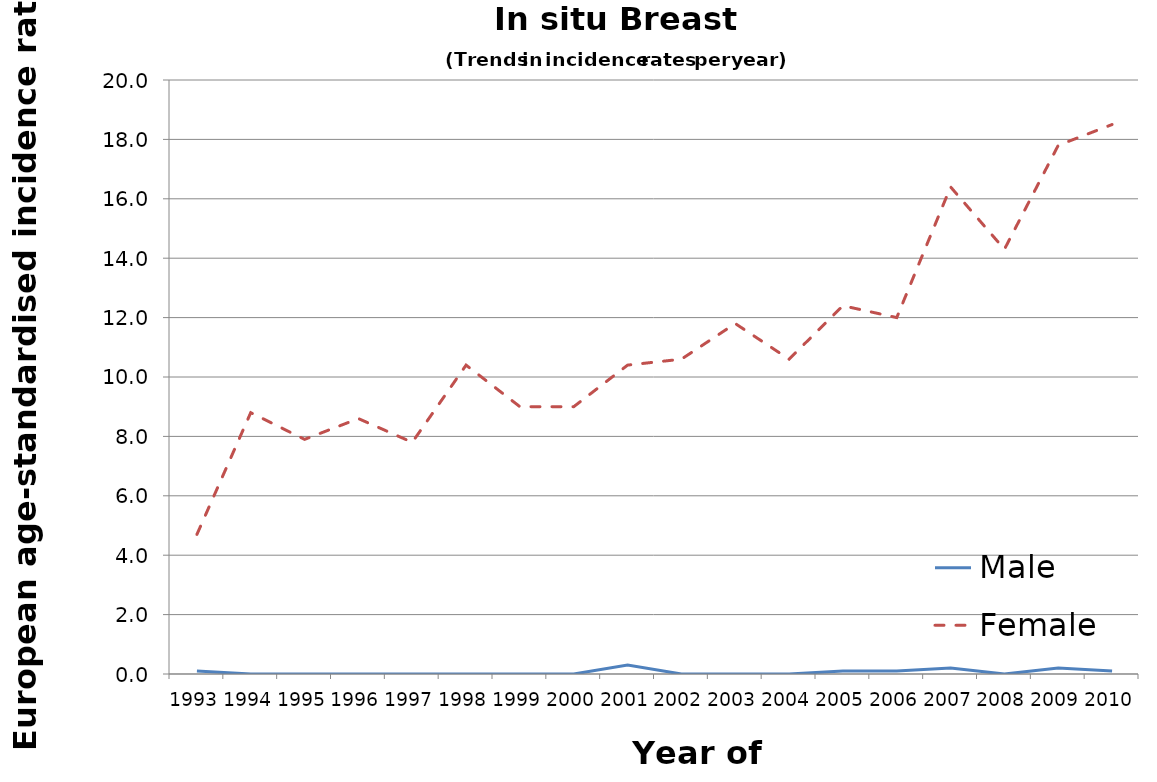
| Category | Male | Female |
|---|---|---|
| 1993.0 | 0.1 | 4.7 |
| 1994.0 | 0 | 8.8 |
| 1995.0 | 0 | 7.9 |
| 1996.0 | 0 | 8.6 |
| 1997.0 | 0 | 7.8 |
| 1998.0 | 0 | 10.4 |
| 1999.0 | 0 | 9 |
| 2000.0 | 0 | 9 |
| 2001.0 | 0.3 | 10.4 |
| 2002.0 | 0 | 10.6 |
| 2003.0 | 0 | 11.8 |
| 2004.0 | 0 | 10.6 |
| 2005.0 | 0.1 | 12.4 |
| 2006.0 | 0.1 | 12 |
| 2007.0 | 0.2 | 16.4 |
| 2008.0 | 0 | 14.3 |
| 2009.0 | 0.2 | 17.8 |
| 2010.0 | 0.1 | 18.5 |